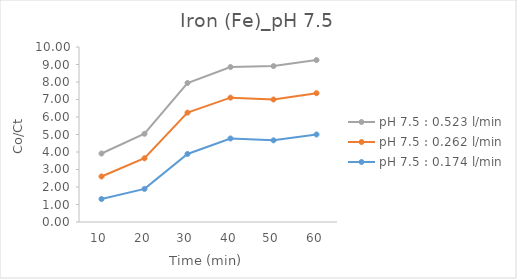
| Category | pH 7.5 : 0.174 l/min | pH 7.5 : 0.262 l/min | pH 7.5 : 0.523 l/min |
|---|---|---|---|
| 10.0 | 1.312 | 1.288 | 1.312 |
| 20.0 | 1.892 | 1.75 | 1.4 |
| 30.0 | 3.889 | 2.36 | 1.694 |
| 40.0 | 4.773 | 2.333 | 1.75 |
| 50.0 | 4.667 | 2.333 | 1.909 |
| 60.0 | 5 | 2.36 | 1.892 |